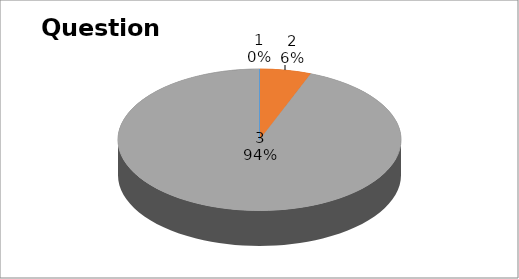
| Category | Series 0 |
|---|---|
| 0 | 0 |
| 1 | 1 |
| 2 | 16 |